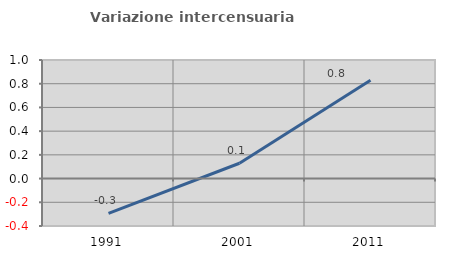
| Category | Variazione intercensuaria annua |
|---|---|
| 1991.0 | -0.294 |
| 2001.0 | 0.129 |
| 2011.0 | 0.83 |